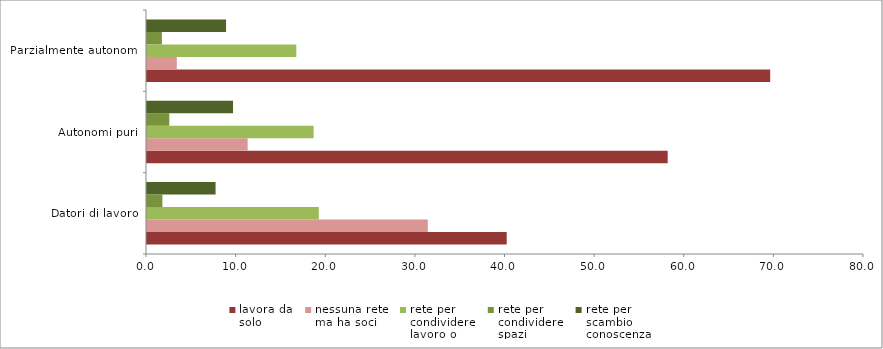
| Category | lavora da
solo | nessuna rete
ma ha soci | rete per
condividere
lavoro o
clienti | rete per
condividere
spazi | rete per
scambio
conoscenza |
|---|---|---|---|---|---|
| Datori di lavoro | 40.136 | 31.329 | 19.167 | 1.718 | 7.65 |
| Autonomi puri | 58.095 | 11.229 | 18.591 | 2.485 | 9.6 |
| Parzialmente autonomi | 69.532 | 3.325 | 16.659 | 1.662 | 8.822 |